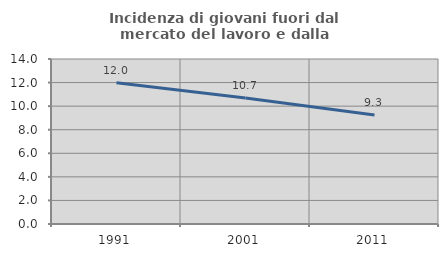
| Category | Incidenza di giovani fuori dal mercato del lavoro e dalla formazione  |
|---|---|
| 1991.0 | 11.986 |
| 2001.0 | 10.698 |
| 2011.0 | 9.254 |